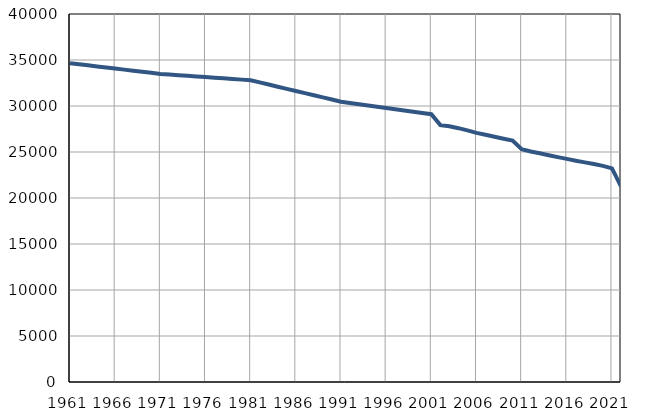
| Category | Population
size |
|---|---|
| 1961.0 | 34654 |
| 1962.0 | 34538 |
| 1963.0 | 34422 |
| 1964.0 | 34305 |
| 1965.0 | 34188 |
| 1966.0 | 34071 |
| 1967.0 | 33955 |
| 1968.0 | 33839 |
| 1969.0 | 33722 |
| 1970.0 | 33606 |
| 1971.0 | 33489 |
| 1972.0 | 33420 |
| 1973.0 | 33352 |
| 1974.0 | 33282 |
| 1975.0 | 33213 |
| 1976.0 | 33144 |
| 1977.0 | 33073 |
| 1978.0 | 33005 |
| 1979.0 | 32936 |
| 1980.0 | 32867 |
| 1981.0 | 32798 |
| 1982.0 | 32565 |
| 1983.0 | 32332 |
| 1984.0 | 32099 |
| 1985.0 | 31866 |
| 1986.0 | 31634 |
| 1987.0 | 31401 |
| 1988.0 | 31168 |
| 1989.0 | 30935 |
| 1990.0 | 30702 |
| 1991.0 | 30469 |
| 1992.0 | 30332 |
| 1993.0 | 30196 |
| 1994.0 | 30059 |
| 1995.0 | 29923 |
| 1996.0 | 29786 |
| 1997.0 | 29650 |
| 1998.0 | 29513 |
| 1999.0 | 29377 |
| 2000.0 | 29240 |
| 2001.0 | 29104 |
| 2002.0 | 27922 |
| 2003.0 | 27792 |
| 2004.0 | 27590 |
| 2005.0 | 27352 |
| 2006.0 | 27081 |
| 2007.0 | 26867 |
| 2008.0 | 26662 |
| 2009.0 | 26447 |
| 2010.0 | 26247 |
| 2011.0 | 25310 |
| 2012.0 | 25056 |
| 2013.0 | 24864 |
| 2014.0 | 24650 |
| 2015.0 | 24443 |
| 2016.0 | 24249 |
| 2017.0 | 24054 |
| 2018.0 | 23874 |
| 2019.0 | 23696 |
| 2020.0 | 23489 |
| 2021.0 | 23218 |
| 2022.0 | 21262 |